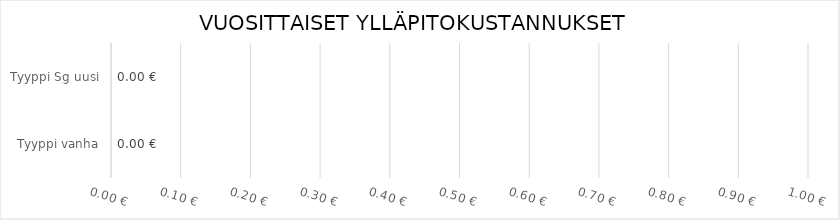
| Category | VUOSITTAISET ENERGIAKUSTANNUKSET €/KWH  |
|---|---|
| Tyyppi vanha | 0 |
| Tyyppi Sg uusi | 0 |